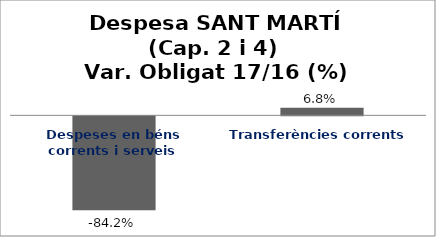
| Category | Series 0 |
|---|---|
| Despeses en béns corrents i serveis | -0.842 |
| Transferències corrents | 0.068 |